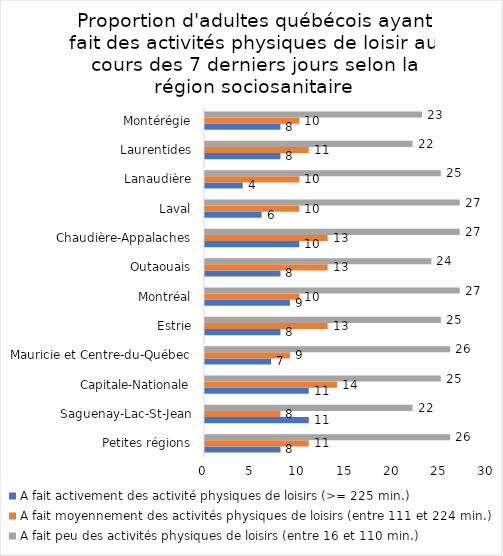
| Category | A fait activement des activité physiques de loisirs (>= 225 min.) | A fait moyennement des activités physiques de loisirs (entre 111 et 224 min.) | A fait peu des activités physiques de loisirs (entre 16 et 110 min.) |
|---|---|---|---|
| Petites régions | 8 | 11 | 26 |
| Saguenay-Lac-St-Jean | 11 | 8 | 22 |
| Capitale-Nationale | 11 | 14 | 25 |
| Mauricie et Centre-du-Québec | 7 | 9 | 26 |
| Estrie | 8 | 13 | 25 |
| Montréal | 9 | 10 | 27 |
| Outaouais | 8 | 13 | 24 |
| Chaudière-Appalaches | 10 | 13 | 27 |
| Laval | 6 | 10 | 27 |
| Lanaudière | 4 | 10 | 25 |
| Laurentides | 8 | 11 | 22 |
| Montérégie | 8 | 10 | 23 |